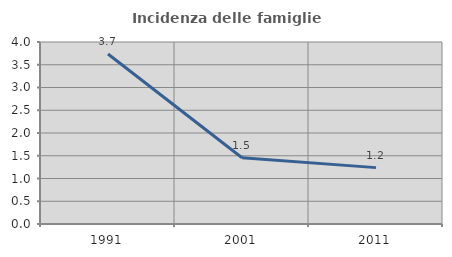
| Category | Incidenza delle famiglie numerose |
|---|---|
| 1991.0 | 3.737 |
| 2001.0 | 1.457 |
| 2011.0 | 1.239 |